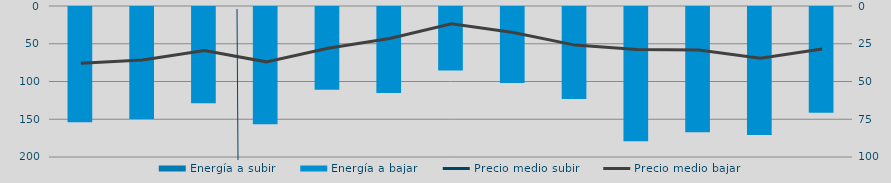
| Category | Energía a subir | Energía a bajar |
|---|---|---|
| D |  | 153.818 |
| E |  | 149.517 |
| F |  | 128.775 |
| M |  | 156.615 |
| A |  | 110.92 |
| M |  | 115.196 |
| J |  | 85.375 |
| J |  | 101.923 |
| A |  | 123.137 |
| S |  | 178.975 |
| O |  | 167.321 |
| N |  | 170.789 |
| D |  | 141.32 |